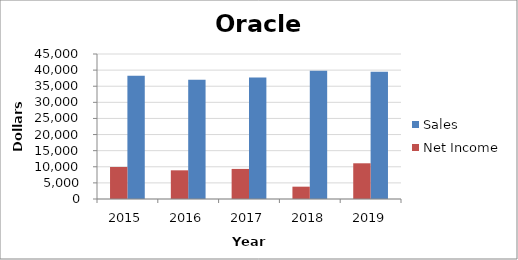
| Category | Sales | Net Income |
|---|---|---|
| 2019.0 | 39506 | 11083 |
| 2018.0 | 39831 | 3825 |
| 2017.0 | 37728 | 9335 |
| 2016.0 | 37047 | 8901 |
| 2015.0 | 38226 | 9938 |